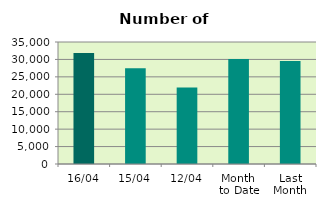
| Category | Series 0 |
|---|---|
| 16/04 | 31814 |
| 15/04 | 27470 |
| 12/04 | 21936 |
| Month 
to Date | 30103.833 |
| Last
Month | 29553.143 |